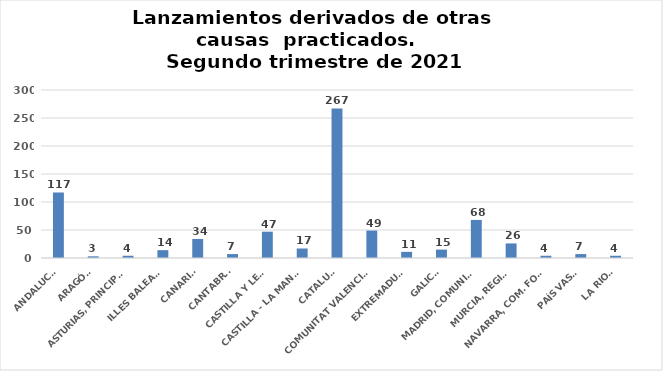
| Category | Series 0 |
|---|---|
| ANDALUCÍA | 117 |
| ARAGÓN | 3 |
| ASTURIAS, PRINCIPADO | 4 |
| ILLES BALEARS | 14 |
| CANARIAS | 34 |
| CANTABRIA | 7 |
| CASTILLA Y LEÓN | 47 |
| CASTILLA - LA MANCHA | 17 |
| CATALUÑA | 267 |
| COMUNITAT VALENCIANA | 49 |
| EXTREMADURA | 11 |
| GALICIA | 15 |
| MADRID, COMUNIDAD | 68 |
| MURCIA, REGIÓN | 26 |
| NAVARRA, COM. FORAL | 4 |
| PAÍS VASCO | 7 |
| LA RIOJA | 4 |